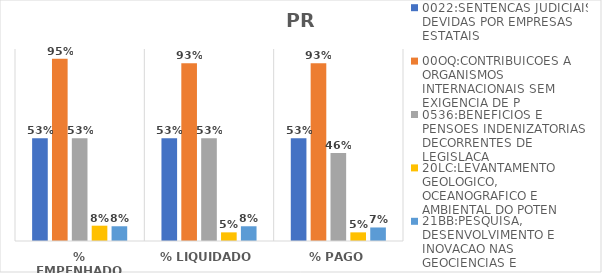
| Category | 0022:SENTENCAS JUDICIAIS DEVIDAS POR EMPRESAS ESTATAIS | 00OQ:CONTRIBUICOES A ORGANISMOS INTERNACIONAIS SEM EXIGENCIA DE P | 0536:BENEFICIOS E PENSOES INDENIZATORIAS DECORRENTES DE LEGISLACA | 20LC:LEVANTAMENTO GEOLOGICO, OCEANOGRAFICO E AMBIENTAL DO POTEN | 21BB:PESQUISA, DESENVOLVIMENTO E INOVACAO NAS GEOCIENCIAS E |
|---|---|---|---|---|---|
| % EMPENHADO | 0.535 | 0.95 | 0.535 | 0.08 | 0.077 |
| % LIQUIDADO | 0.535 | 0.926 | 0.535 | 0.045 | 0.077 |
| % PAGO | 0.535 | 0.926 | 0.459 | 0.045 | 0.07 |